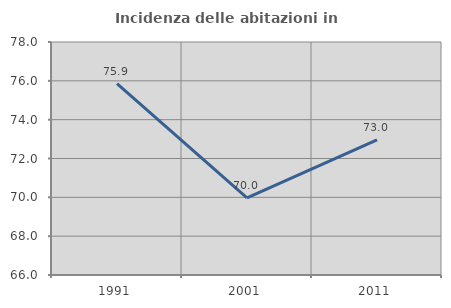
| Category | Incidenza delle abitazioni in proprietà  |
|---|---|
| 1991.0 | 75.859 |
| 2001.0 | 69.975 |
| 2011.0 | 72.957 |